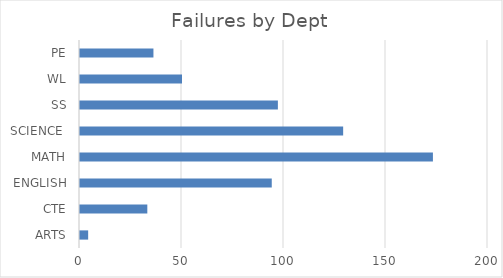
| Category | Series 0 |
|---|---|
| ARTS | 4 |
| CTE | 33 |
| ENGLISH | 94 |
| MATH | 173 |
| SCIENCE  | 129 |
| SS | 97 |
| WL | 50 |
| PE | 36 |